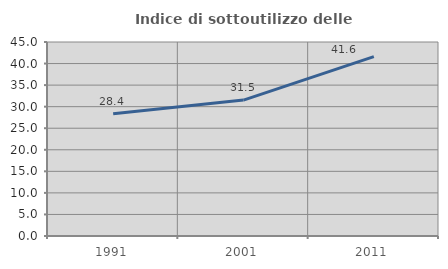
| Category | Indice di sottoutilizzo delle abitazioni  |
|---|---|
| 1991.0 | 28.353 |
| 2001.0 | 31.533 |
| 2011.0 | 41.614 |